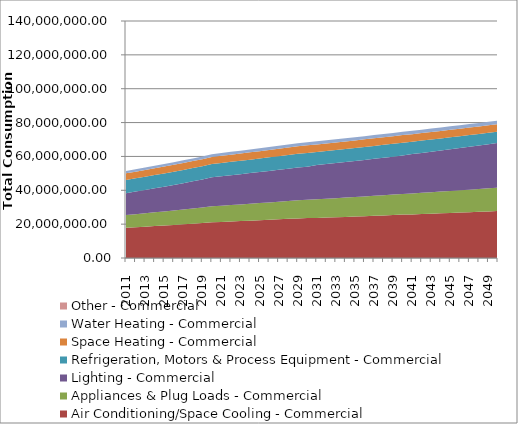
| Category | Air Conditioning/Space Cooling - Commercial | Appliances & Plug Loads - Commercial | Lighting - Commercial | Refrigeration, Motors & Process Equipment - Commercial | Space Heating - Commercial | Water Heating - Commercial | Other - Commercial |
|---|---|---|---|---|---|---|---|
| 2011.0 | 17875058.365 | 7508065.55 | 12938032.975 | 7789867.564 | 3915970.211 | 1370406.479 | 0 |
| 2012.0 | 18195388.395 | 7704014.844 | 13348039.528 | 7802224.022 | 3947689.397 | 1396918.18 | 0 |
| 2013.0 | 18521374.302 | 7904807.74 | 13769300.352 | 7811930.949 | 3979101.842 | 1423941.939 | 0 |
| 2014.0 | 18853113.914 | 8110559.654 | 14202102.077 | 7818876.859 | 4010182.468 | 1451487.753 | 0 |
| 2015.0 | 19190706.962 | 8321388.938 | 14646738.563 | 7822946.857 | 4040905.251 | 1479565.565 | 0 |
| 2016.0 | 19534254.602 | 8537416.505 | 15103510.625 | 7824022.478 | 4071243.256 | 1508185.763 | 0 |
| 2017.0 | 19883859.957 | 8758766.077 | 15572726.388 | 7821981.857 | 4101168.675 | 1537358.74 | 0 |
| 2018.0 | 20239627.62 | 8985564.451 | 16054701.664 | 7816699.239 | 4130652.536 | 1567095.087 | 0 |
| 2019.0 | 20601664.216 | 9217941.165 | 16549759.657 | 7808045.142 | 4159665.075 | 1597405.805 | 0 |
| 2020.0 | 21054363.133 | 9494035.475 | 17126794.014 | 7827220.271 | 4205009.014 | 1634846.549 | 0 |
| 2021.0 | 21301667.815 | 9616931.535 | 17362109.721 | 7860247.093 | 4236219.607 | 1650878.714 | 0 |
| 2022.0 | 21551873.137 | 9741392.656 | 17600556.509 | 7893020.946 | 4267598.572 | 1667064.455 | 0 |
| 2023.0 | 21805013.076 | 9867438.663 | 17842175.238 | 7925531.819 | 4299145.877 | 1683405.197 | 0 |
| 2024.0 | 22061122.005 | 9995089.333 | 18087007.074 | 7957769.736 | 4330861.171 | 1699902.451 | 0 |
| 2025.0 | 22320234.699 | 10124364.988 | 18335093.779 | 7989724.303 | 4362744.373 | 1716557.517 | 0 |
| 2026.0 | 22582386.341 | 10255285.899 | 18586477.65 | 8021385 | 4394795.075 | 1733371.93 | 0 |
| 2027.0 | 22847612.525 | 10387872.818 | 18841201.523 | 8052741.106 | 4427013.148 | 1750347.166 | 0 |
| 2028.0 | 23115949.261 | 10522146.759 | 19099308.705 | 8083781.617 | 4459398.124 | 1767484.79 | 0 |
| 2029.0 | 23387432.98 | 10658128.758 | 19360843.29 | 8114495.556 | 4491949.821 | 1784786.147 | 0 |
| 2030.0 | 23608641.186 | 10771449.587 | 19581509.372 | 8126469.94 | 4514445.211 | 1798181.031 | 0 |
| 2031.0 | 23653130.998 | 11007978.675 | 20243511.134 | 7764929.066 | 4409812.376 | 1815571.853 | 0 |
| 2032.0 | 23861940.77 | 11134990.047 | 20509746.104 | 7741385.945 | 4420586.348 | 1829522.274 | 0 |
| 2033.0 | 24074420.69 | 11262149.557 | 20774649.74 | 7720600.608 | 4432496.095 | 1843536.731 | 0 |
| 2034.0 | 24290294.712 | 11389671.372 | 21038974.693 | 7701945.979 | 4445329.8 | 1857622.462 | 0 |
| 2035.0 | 24509183.34 | 11517840.869 | 21303728.471 | 7684578.763 | 4458801.927 | 1871788.729 | 0 |
| 2036.0 | 24730586.152 | 11647025.73 | 21570216.001 | 7667402.936 | 4472541.176 | 1886047.749 | 0 |
| 2037.0 | 24953863.164 | 11777689.674 | 21840085.651 | 7649030.48 | 4486076.246 | 1900414.392 | 0 |
| 2038.0 | 25178213.427 | 11910406.246 | 22115382.052 | 7627736.852 | 4498821.455 | 1914907.417 | 0 |
| 2039.0 | 25402651.41 | 12045875.152 | 22398602.855 | 7601412.629 | 4510059.774 | 1929549.282 | 0 |
| 2040.0 | 25625982.114 | 12184939.434 | 22692761.357 | 7567509.859 | 4518924.991 | 1944367.355 | 0 |
| 2041.0 | 25753247.422 | 12392433.863 | 23231039.84 | 7327847.493 | 4457865.243 | 1961433.64 | 0 |
| 2042.0 | 25967391.016 | 12543531.203 | 23564431.954 | 7264074.883 | 4456975.383 | 1976759.531 | 0 |
| 2043.0 | 26183302.576 | 12696345.651 | 23901947.092 | 7198556.968 | 4455707.141 | 1992202.345 | 0 |
| 2044.0 | 26400996.665 | 12850895.794 | 24243632.315 | 7131267.644 | 4454053.95 | 2007762.944 | 0 |
| 2045.0 | 26620487.968 | 13007200.689 | 24589535.563 | 7062180.116 | 4452008.88 | 2023442.196 | 0 |
| 2046.0 | 26841791.011 | 13165279.323 | 24939704.93 | 6991267.616 | 4449565 | 2039240.977 | 0 |
| 2047.0 | 27064920.809 | 13325150.972 | 25294189.409 | 6918502.671 | 4446715.195 | 2055160.166 | 0 |
| 2048.0 | 27289892.124 | 13486835.118 | 25653038.153 | 6843857.832 | 4443452.531 | 2071200.652 | 0 |
| 2049.0 | 27516720.216 | 13650351.446 | 26016301.23 | 6767305.027 | 4439769.702 | 2087363.326 | 0 |
| 2050.0 | 27745420.087 | 13815719.753 | 26384028.873 | 6688815.826 | 4435659.399 | 2103649.09 | 0 |